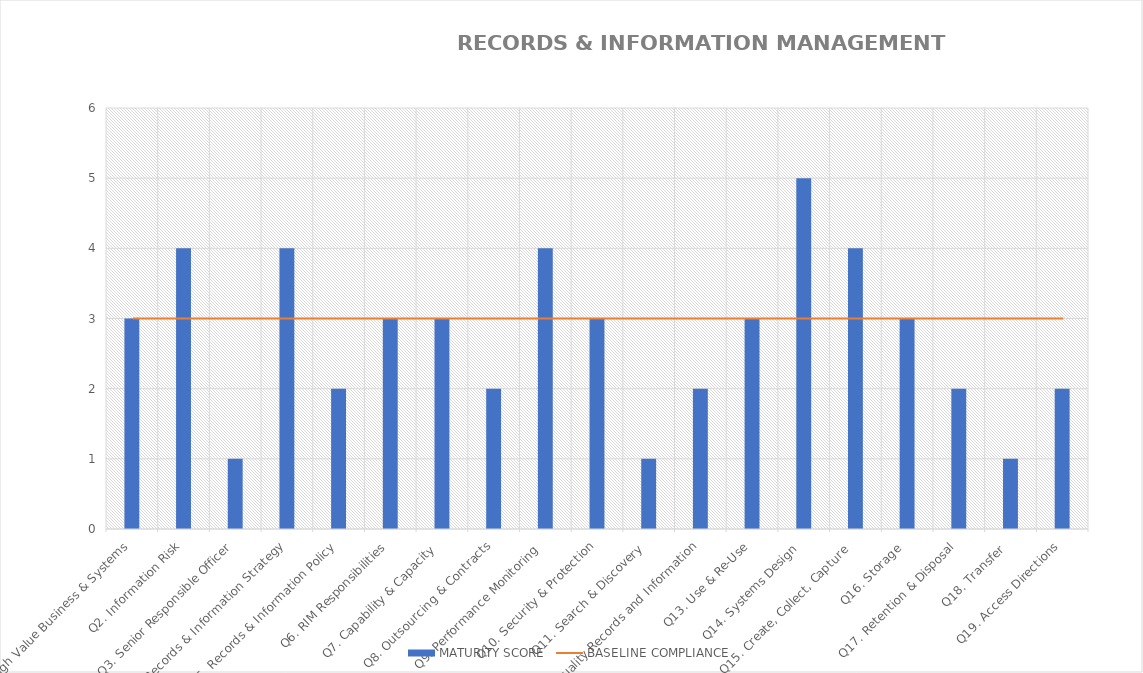
| Category | MATURITY SCORE |
|---|---|
| Q1. High Risk / High Value Business & Systems | 3 |
| Q2. Information Risk | 4 |
| Q3. Senior Responsible Officer | 1 |
| Q4. Records & Information Strategy | 4 |
| Q5. Records & Information Policy | 2 |
| Q6. RIM Responsibilities | 3 |
| Q7. Capability & Capacity  | 3 |
| Q8. Outsourcing & Contracts | 2 |
| Q9. Performance Monitoring  | 4 |
| Q10. Security & Protection | 3 |
| Q11. Search & Discovery  | 1 |
| Q12. Quality Records and Information | 2 |
| Q13. Use & Re-Use | 3 |
| Q14. Systems Design  | 5 |
| Q15. Create, Collect, Capture  | 4 |
| Q16. Storage  | 3 |
| Q17. Retention & Disposal | 2 |
| Q18. Transfer  | 1 |
| Q19. Access Directions | 2 |